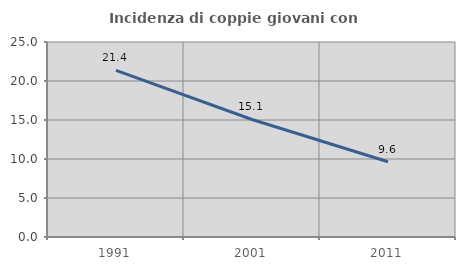
| Category | Incidenza di coppie giovani con figli |
|---|---|
| 1991.0 | 21.373 |
| 2001.0 | 15.067 |
| 2011.0 | 9.642 |